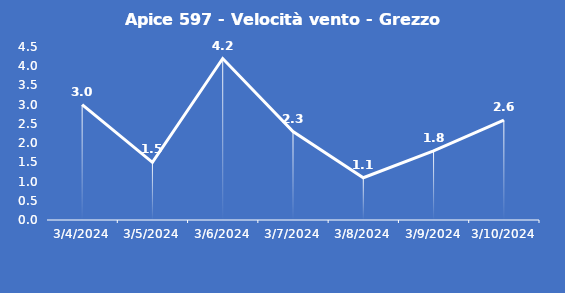
| Category | Apice 597 - Velocità vento - Grezzo (m/s) |
|---|---|
| 3/4/24 | 3 |
| 3/5/24 | 1.5 |
| 3/6/24 | 4.2 |
| 3/7/24 | 2.3 |
| 3/8/24 | 1.1 |
| 3/9/24 | 1.8 |
| 3/10/24 | 2.6 |